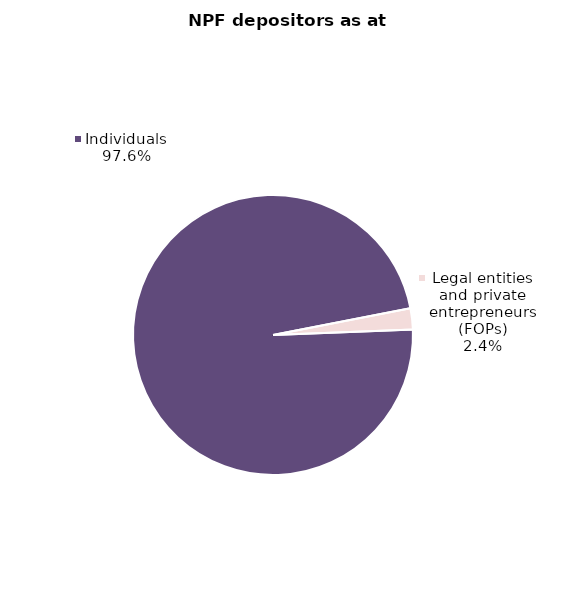
| Category | Series 0 |
|---|---|
| Legal entities and private entrepreneurs (FOPs) | 2038 |
| Individuals | 81423 |